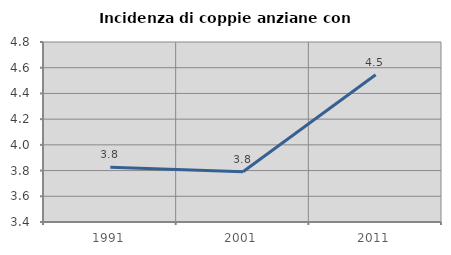
| Category | Incidenza di coppie anziane con figli |
|---|---|
| 1991.0 | 3.825 |
| 2001.0 | 3.791 |
| 2011.0 | 4.545 |